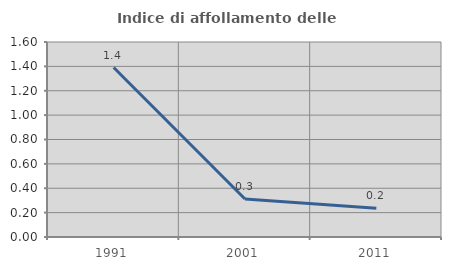
| Category | Indice di affollamento delle abitazioni  |
|---|---|
| 1991.0 | 1.391 |
| 2001.0 | 0.312 |
| 2011.0 | 0.237 |